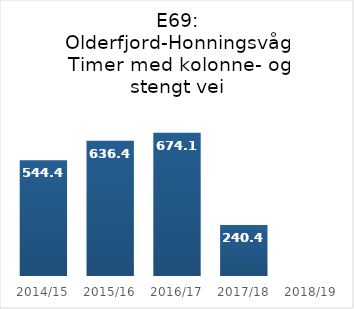
| Category | TOTTID |
|---|---|
| 2014/15 | 544.4 |
| 2015/16 | 636.4 |
| 2016/17 | 674.1 |
| 2017/18 | 240.4 |
| 2018/19 | 0 |